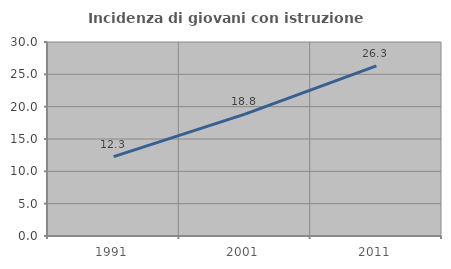
| Category | Incidenza di giovani con istruzione universitaria |
|---|---|
| 1991.0 | 12.268 |
| 2001.0 | 18.85 |
| 2011.0 | 26.295 |